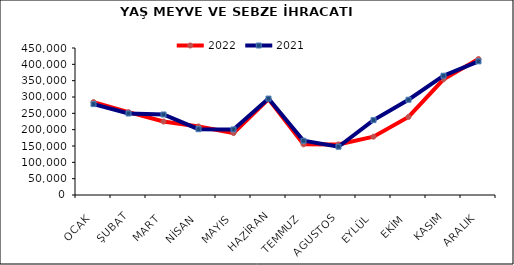
| Category | 2022 | 2021 |
|---|---|---|
| OCAK | 284427.628 | 278127.632 |
| ŞUBAT | 253754.069 | 249528.273 |
| MART | 224880.329 | 246515.34 |
| NİSAN | 209879.049 | 201459.413 |
| MAYIS | 189527.817 | 200725.907 |
| HAZİRAN | 293476.039 | 295140.736 |
| TEMMUZ | 155050.485 | 166029.302 |
| AGUSTOS | 154825.082 | 147760.259 |
| EYLÜL | 178508.833 | 229150.724 |
| EKİM | 238984.633 | 291587.593 |
| KASIM | 354188.202 | 365157.711 |
| ARALIK | 416159.518 | 409189.455 |